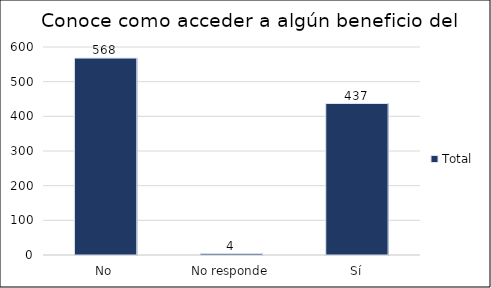
| Category | Total |
|---|---|
| No | 568 |
| No responde | 4 |
| Sí | 437 |